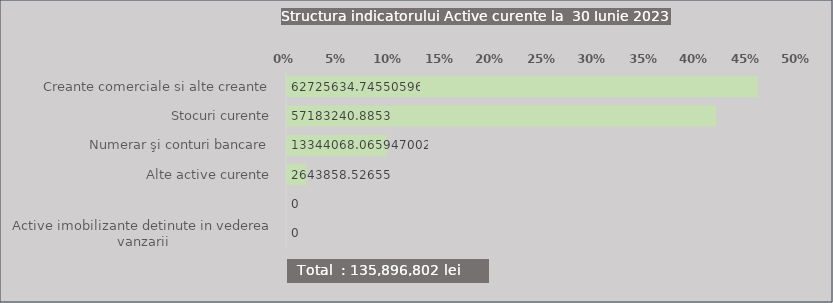
| Category | Series 0 |
|---|---|
| Creante comerciale si alte creante | 0.462 |
| Stocuri curente | 0.421 |
| Numerar şi conturi bancare | 0.098 |
| Alte active curente | 0.019 |
|  | 0 |
| Active imobilizante detinute in vederea vanzarii | 0 |